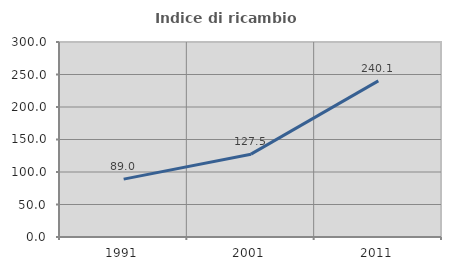
| Category | Indice di ricambio occupazionale  |
|---|---|
| 1991.0 | 89.011 |
| 2001.0 | 127.451 |
| 2011.0 | 240.132 |